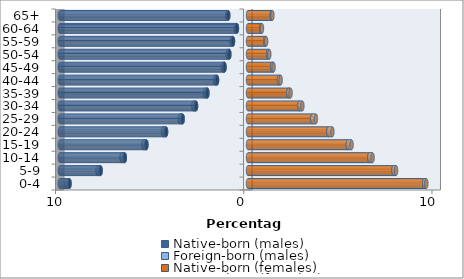
| Category | Native-born (males) | Foreign-born (males) | Native-born (females) | Foreign-born (females) |
|---|---|---|---|---|
| 0-4 | -9.48 | -0.17 | 9.359 | 0.114 |
| 5-9 | -7.829 | -0.172 | 7.726 | 0.139 |
| 10-14 | -6.544 | -0.177 | 6.446 | 0.173 |
| 15-19 | -5.396 | -0.169 | 5.303 | 0.197 |
| 20-24 | -4.351 | -0.166 | 4.27 | 0.212 |
| 25-29 | -3.471 | -0.16 | 3.414 | 0.194 |
| 30-34 | -2.76 | -0.148 | 2.735 | 0.153 |
| 35-39 | -2.157 | -0.13 | 2.147 | 0.115 |
| 40-44 | -1.643 | -0.109 | 1.646 | 0.088 |
| 45-49 | -1.247 | -0.095 | 1.285 | 0.073 |
| 50-54 | -0.991 | -0.083 | 1.069 | 0.062 |
| 55-59 | -0.796 | -0.074 | 0.914 | 0.051 |
| 60-64 | -0.587 | -0.069 | 0.7 | 0.042 |
| 65+ | -1.048 | -0.06 | 1.265 | 0.032 |